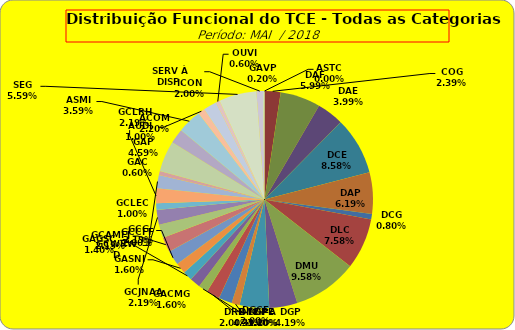
| Category | ASTC |
|---|---|
| ASTC | 0 |
| COG | 12 |
| DAF | 30 |
| DAE | 20 |
| DCE | 43 |
| DAP | 31 |
| DCG | 4 |
| DLC | 38 |
| DMU | 48 |
| DGP | 21 |
| DIN | 22 |
| DPE | 6 |
| DRR | 10 |
| DGCE | 10 |
| DGPA | 7 |
| GACMG | 8 |
| GAGSC | 7 |
| GASNI | 8 |
| GCG | 11 |
| GCAMFJ | 11 |
| GCCFF | 10 |
| GCJNAA | 11 |
| GCLEC | 5 |
| GCLRH | 11 |
| GCWRWD | 10 |
| GAC | 3 |
| GAP | 23 |
| ACOM | 11 |
| ASMI | 18 |
| AUDI | 5 |
| ICON | 10 |
| OUVI | 3 |
| SEG | 28 |
| SERV À DISP. | 5 |
| GAVP | 1 |